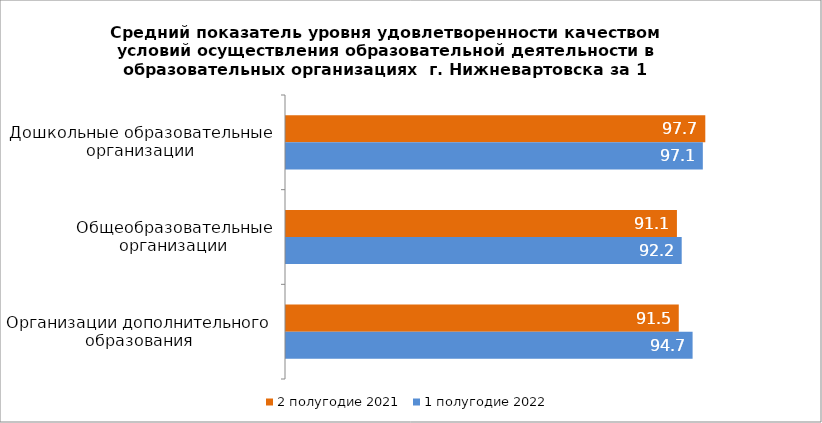
| Category | 2 полугодие 2021 | 1 полугодие 2022 |
|---|---|---|
| Дошкольные образовательные организации | 97.7 | 97.125 |
| Общеобразовательные организации | 91.09 | 92.202 |
| Организации дополнительного образования | 91.52 | 94.74 |